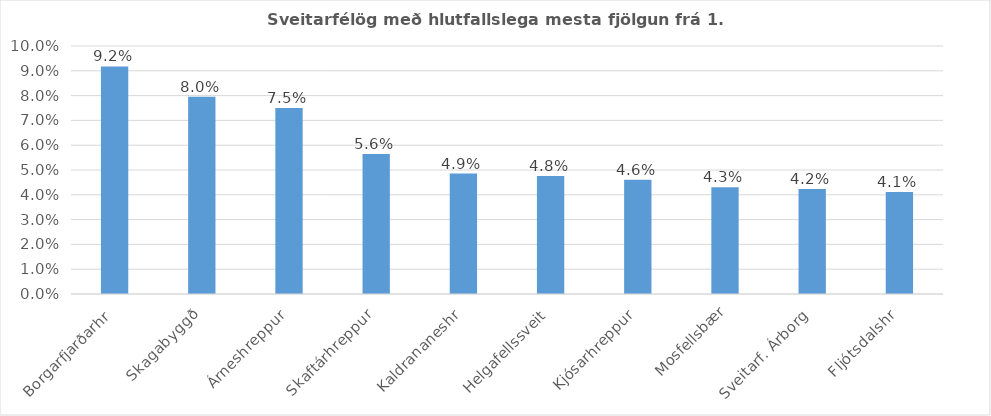
| Category | Breytingar |
|---|---|
| Borgarfjarðarhr | 0.092 |
| Skagabyggð | 0.08 |
| Árneshreppur | 0.075 |
| Skaftárhreppur | 0.056 |
| Kaldrananeshr | 0.049 |
| Helgafellssveit | 0.048 |
| Kjósarhreppur | 0.046 |
| Mosfellsbær | 0.043 |
| Sveitarf. Árborg | 0.042 |
| Fljótsdalshr | 0.041 |